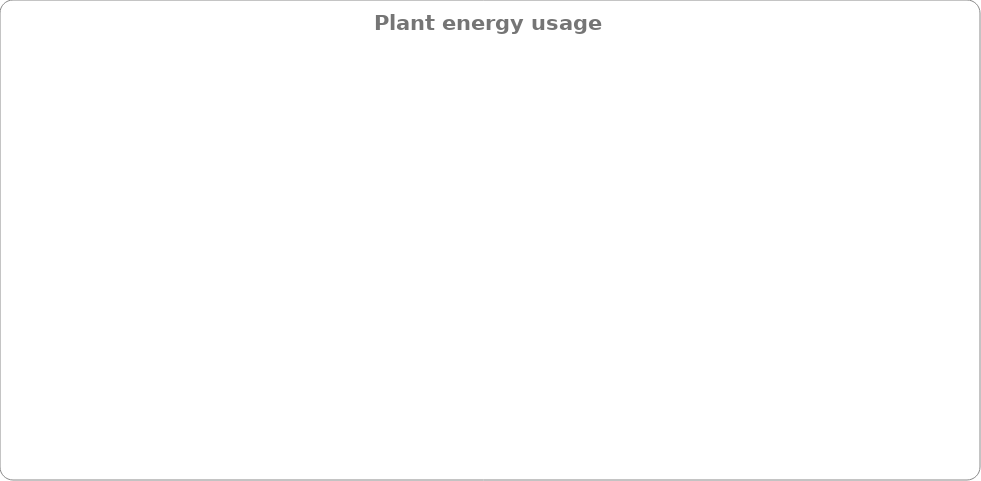
| Category | Series 0 |
|---|---|
| Chiller kWh | 0 |
| Chwp kWh | 0 |
| Cwp kWh | 0 |
| Ct kWh | 0 |